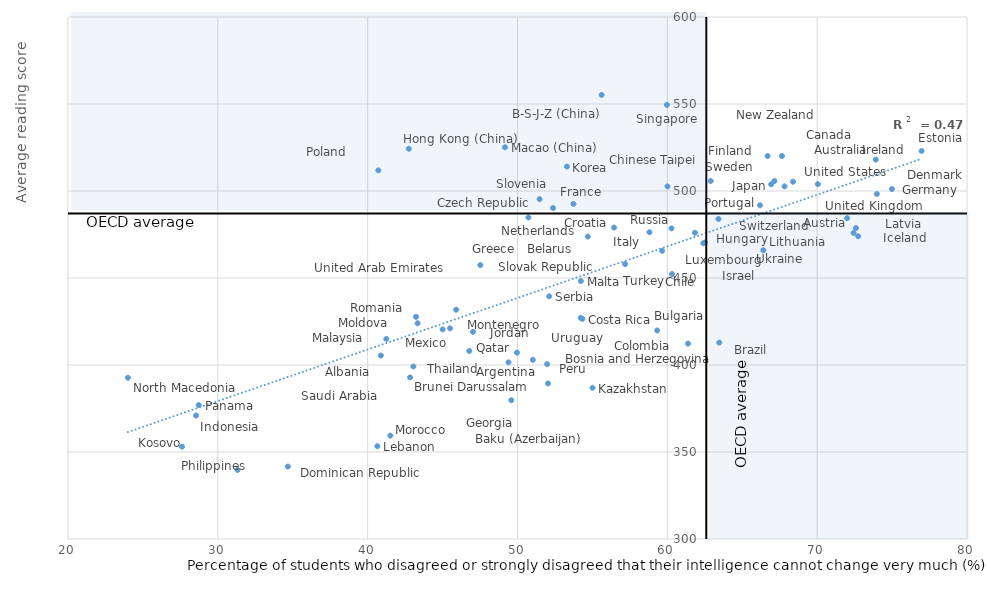
| Category | Series 0 |
|---|---|
| 60.31383462749388 | 452.273 |
| 45.49602474651546 | 421.058 |
| 66.92861028695366 | 503.856 |
| 45.00530600822023 | 420.469 |
| 55.00504390449126 | 386.909 |
| 61.84390158025558 | 475.987 |
| 53.73417156037802 | 492.606 |
| 67.64977365817802 | 520.086 |
| 52.11596868481517 | 439.466 |
| 49.16424183261266 | 525.116 |
| 54.64456249961916 | 424.358 |
| 47.03207991507619 | 419.064 |
| 68.38893950669184 | 505.353 |
| 49.39763201708124 | 401.503 |
| 74.98815142724519 | 501.13 |
| 41.24381575375816 | 414.98 |
| 40.64581077593275 | 353.355 |
| 41.51075515543328 | 359.388 |
| 73.90991191634369 | 518.078 |
| 66.4082486648846 | 465.95 |
| 46.77989925123314 | 408.07 |
| 51.47655206728626 | 495.346 |
| 62.51389023840753 | 470.415 |
| 49.9658942452461 | 407.092 |
| 58.80693532966816 | 476.285 |
| 67.82169266050757 | 502.632 |
| 51.97637631680634 | 400.514 |
| 56.44358284260176 | 478.989 |
| 73.98539230222127 | 498.279 |
| 28.72529204552293 | 376.971 |
| 54.2291076496855 | 448.235 |
| 34.67386111980533 | 341.626 |
| 71.99920287900522 | 484.393 |
| 60.27559009278974 | 478.502 |
| 40.88019834609486 | 405.429 |
| 52.37054043403197 | 490.219 |
| 72.73631297485196 | 473.974 |
| 59.32138838792498 | 419.844 |
| 76.96838874116261 | 523.017 |
| 62.89999116767056 | 505.785 |
| 72.5880825418006 | 478.699 |
| 63.413549432418 | 483.929 |
| 59.97322212212228 | 549.465 |
| 53.29979275938322 | 514.052 |
| 43.33489136728893 | 423.993 |
| 67.14920978860786 | 505.727 |
| 42.74697198086088 | 524.283 |
| 61.38212774038458 | 412.295 |
| 59.65312566731055 | 465.632 |
| 50.72861094995262 | 484.784 |
| 72.43352585579962 | 475.873 |
| 49.58669266829607 | 379.753 |
| 55.61305690976842 | 555.236 |
| 51.02330296553355 | 402.978 |
| 42.83212154953544 | 392.889 |
| 52.03868042553486 | 389.388 |
| 43.2253161833051 | 427.703 |
| 66.6912828258988 | 520.079 |
| 40.71433799456746 | 511.856 |
| 27.60877261034241 | 353.065 |
| 66.18318954761918 | 491.801 |
| 63.466174544079 | 412.873 |
| 54.33297989705 | 426.498 |
| 45.90964377583938 | 431.782 |
| 57.18273518727672 | 457.984 |
| 54.21845067982102 | 427.118 |
| 28.546737488581 | 370.965 |
| 23.99834131711434 | 392.668 |
| 60.01113726106851 | 502.601 |
| 43.04950724779488 | 399.152 |
| 47.52106478503743 | 457.414 |
| 31.31602718878825 | 339.692 |
| 62.40007430124667 | 469.985 |
| 54.69026756080895 | 473.788 |
| 70.04524207050082 | 503.928 |